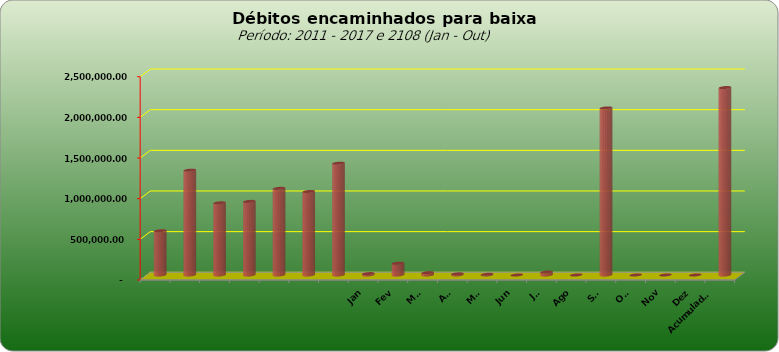
| Category |  543.796,20  |
|---|---|
|  | 543796.2 |
|  | 1289053.69 |
|  | 887573.08 |
|  | 905052.31 |
|  | 1065434.28 |
|  | 1027209.41 |
|  | 1374800.36 |
| Jan | 17005.62 |
| Fev | 145413 |
| Mar | 28943.58 |
| Abr | 13957.8 |
| Mai | 8316.5 |
| Jun | 0 |
| Jul | 35839.29 |
| Ago | 627.19 |
| Set | 2054577.66 |
| Out | 0 |
| Nov | 0 |
| Dez | 0 |
| Acumulado
2016 | 2304680.64 |